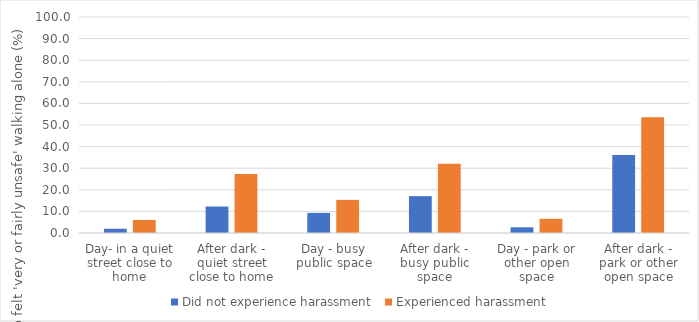
| Category | Did not experience harassment  | Experienced harassment |
|---|---|---|
| Day- in a quiet street close to home | 1.965 | 6.027 |
| After dark - quiet street close to home | 12.257 | 27.342 |
| Day - busy public space | 9.311 | 15.345 |
| After dark - busy public space | 17.062 | 32.05 |
| Day - park or other open space | 2.634 | 6.568 |
| After dark - park or other open space | 36.065 | 53.56 |